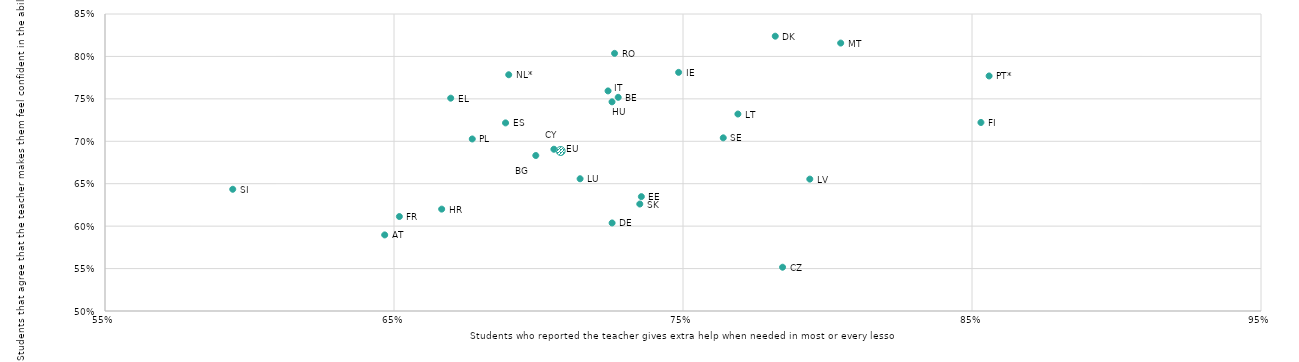
| Category | Series 0 |
|---|---|
| 0.646780058387688 | 0.59 |
| 0.727583233120939 | 0.752 |
| 0.699062918113431 | 0.683 |
| 0.705324840696704 | 0.691 |
| 0.784455752273694 | 0.552 |
| 0.725465495316256 | 0.604 |
| 0.781920513692828 | 0.824 |
| 0.735591256520089 | 0.635 |
| 0.669625633766801 | 0.751 |
| 0.688598878197757 | 0.722 |
| 0.707662817685178 | 0.689 |
| 0.853088660057413 | 0.722 |
| 0.65185710068317 | 0.611 |
| 0.666498795565236 | 0.62 |
| 0.725438126834399 | 0.747 |
| 0.748478392561093 | 0.781 |
| 0.72406807506652 | 0.759 |
| 0.768998279427146 | 0.732 |
| 0.714393299689753 | 0.656 |
| 0.793879124064226 | 0.655 |
| 0.804567317244788 | 0.816 |
| 0.68969163940442 | 0.778 |
| 0.677078280990511 | 0.703 |
| 0.855917510436981 | 0.777 |
| 0.726319200029739 | 0.804 |
| 0.763930490623051 | 0.704 |
| 0.59420064042632 | 0.643 |
| 0.735052479445956 | 0.626 |